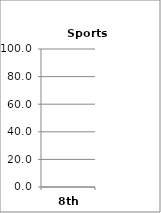
| Category | Sports (Choices) |
|---|---|
| 8th | 0 |